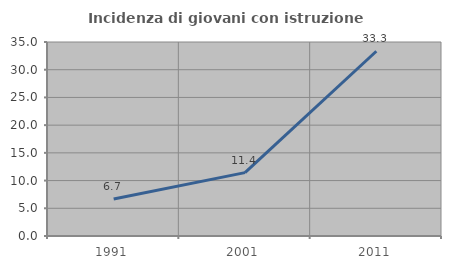
| Category | Incidenza di giovani con istruzione universitaria |
|---|---|
| 1991.0 | 6.667 |
| 2001.0 | 11.429 |
| 2011.0 | 33.333 |